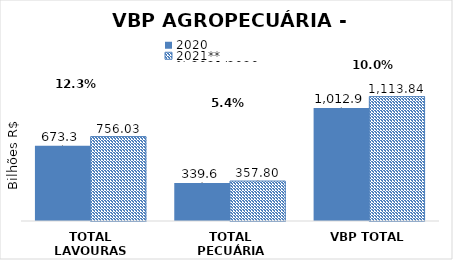
| Category | 2020 | 2021** |
|---|---|---|
| TOTAL LAVOURAS | 673.315 | 756.032 |
| TOTAL PECUÁRIA | 339.612 | 357.804 |
| VBP TOTAL | 1012.927 | 1113.836 |